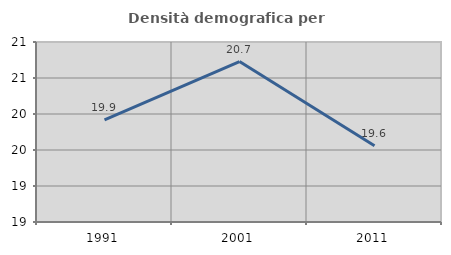
| Category | Densità demografica |
|---|---|
| 1991.0 | 19.92 |
| 2001.0 | 20.729 |
| 2011.0 | 19.56 |